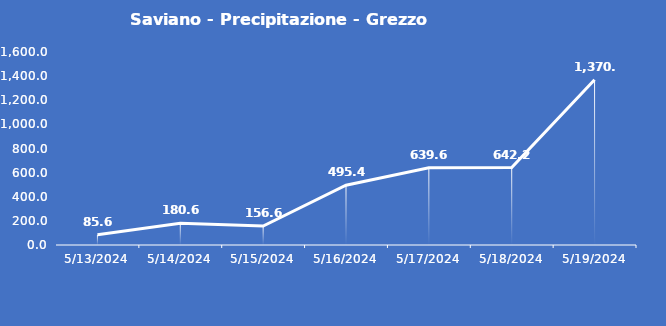
| Category | Saviano - Precipitazione - Grezzo (mm) |
|---|---|
| 5/13/24 | 85.6 |
| 5/14/24 | 180.6 |
| 5/15/24 | 156.6 |
| 5/16/24 | 495.4 |
| 5/17/24 | 639.6 |
| 5/18/24 | 642.2 |
| 5/19/24 | 1370.6 |